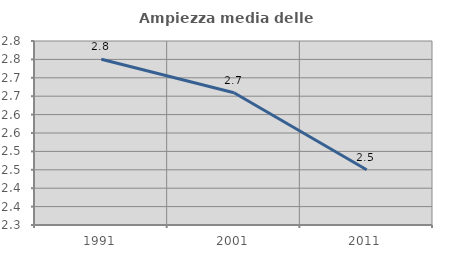
| Category | Ampiezza media delle famiglie |
|---|---|
| 1991.0 | 2.75 |
| 2001.0 | 2.659 |
| 2011.0 | 2.45 |